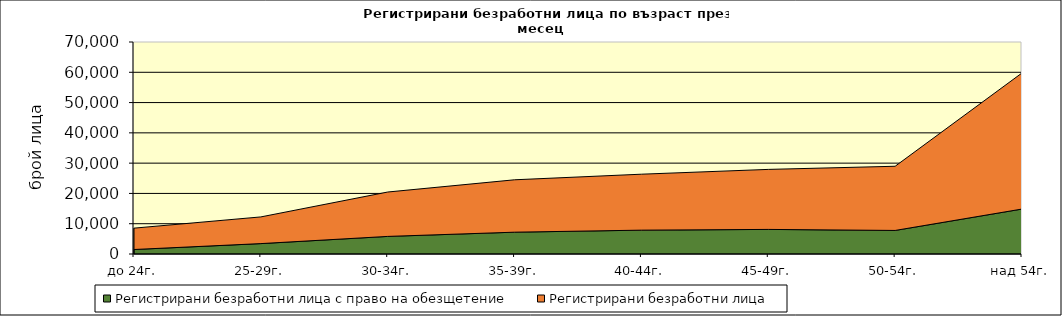
| Category | Регистрирани безработни лица с право на обезщетение | Регистрирани безработни лица |
|---|---|---|
| до 24г. | 1481 | 7056 |
| 25-29г. | 3436 | 8807 |
| 30-34г. | 5808 | 14657 |
| 35-39г. | 7207 | 17298 |
| 40-44г. | 7875 | 18474 |
| 45-49г. | 8116 | 19816 |
| 50-54г. | 7775 | 21195 |
| над 54г. | 14848 | 44927 |